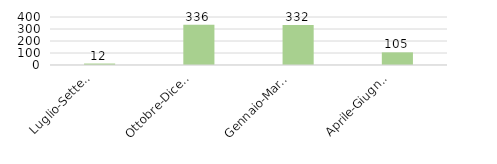
| Category | Abruzzo |
|---|---|
| Luglio-Settembre 
2020 | 12.304 |
| Ottobre-Dicembre 
2020 | 335.815 |
| Gennaio-Marzo 
2021 | 332.478 |
| Aprile-Giugno
 2021 | 105.385 |